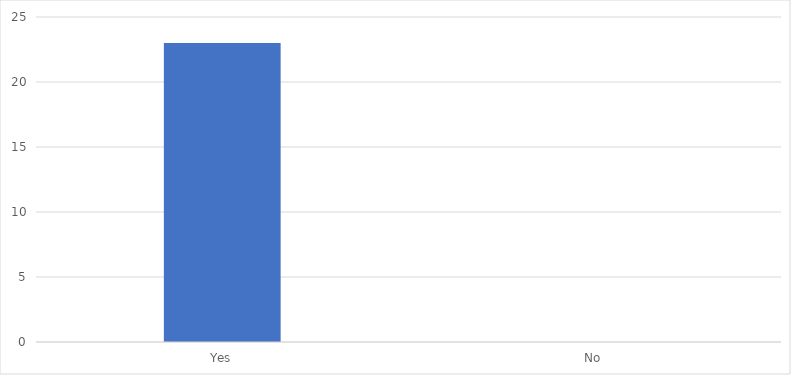
| Category | Number of Responses |
|---|---|
| Yes | 23 |
| No | 0 |